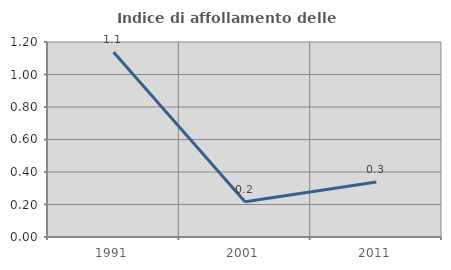
| Category | Indice di affollamento delle abitazioni  |
|---|---|
| 1991.0 | 1.137 |
| 2001.0 | 0.217 |
| 2011.0 | 0.338 |